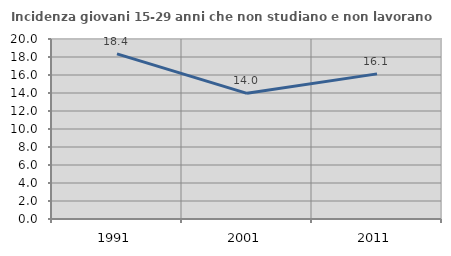
| Category | Incidenza giovani 15-29 anni che non studiano e non lavorano  |
|---|---|
| 1991.0 | 18.351 |
| 2001.0 | 13.962 |
| 2011.0 | 16.126 |